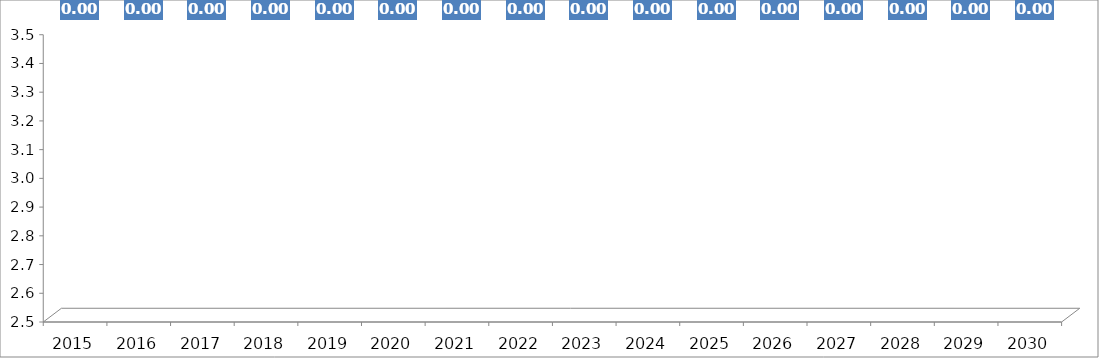
| Category | TCO |
|---|---|
| 2015.0 | 0 |
| 2016.0 | 0 |
| 2017.0 | 0 |
| 2018.0 | 0 |
| 2019.0 | 0 |
| 2020.0 | 0 |
| 2021.0 | 0 |
| 2022.0 | 0 |
| 2023.0 | 0 |
| 2024.0 | 0 |
| 2025.0 | 0 |
| 2026.0 | 0 |
| 2027.0 | 0 |
| 2028.0 | 0 |
| 2029.0 | 0 |
| 2030.0 | 0 |